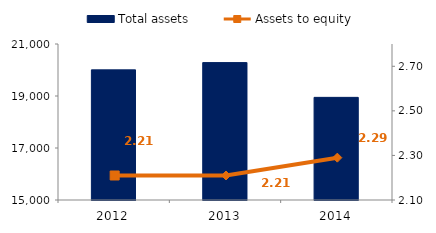
| Category | Total assets |
|---|---|
| 2012.0 | 20005 |
| 2013.0 | 20284.8 |
| 2014.0 | 18947.3 |